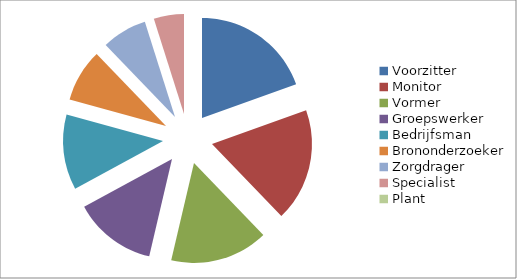
| Category | Series 0 |
|---|---|
| Voorzitter | 48 |
| Monitor | 45 |
| Vormer | 39 |
| Groepswerker | 33 |
| Bedrijfsman | 30 |
| Brononderzoeker | 21 |
| Zorgdrager | 18 |
| Specialist | 12 |
| Plant | 0 |